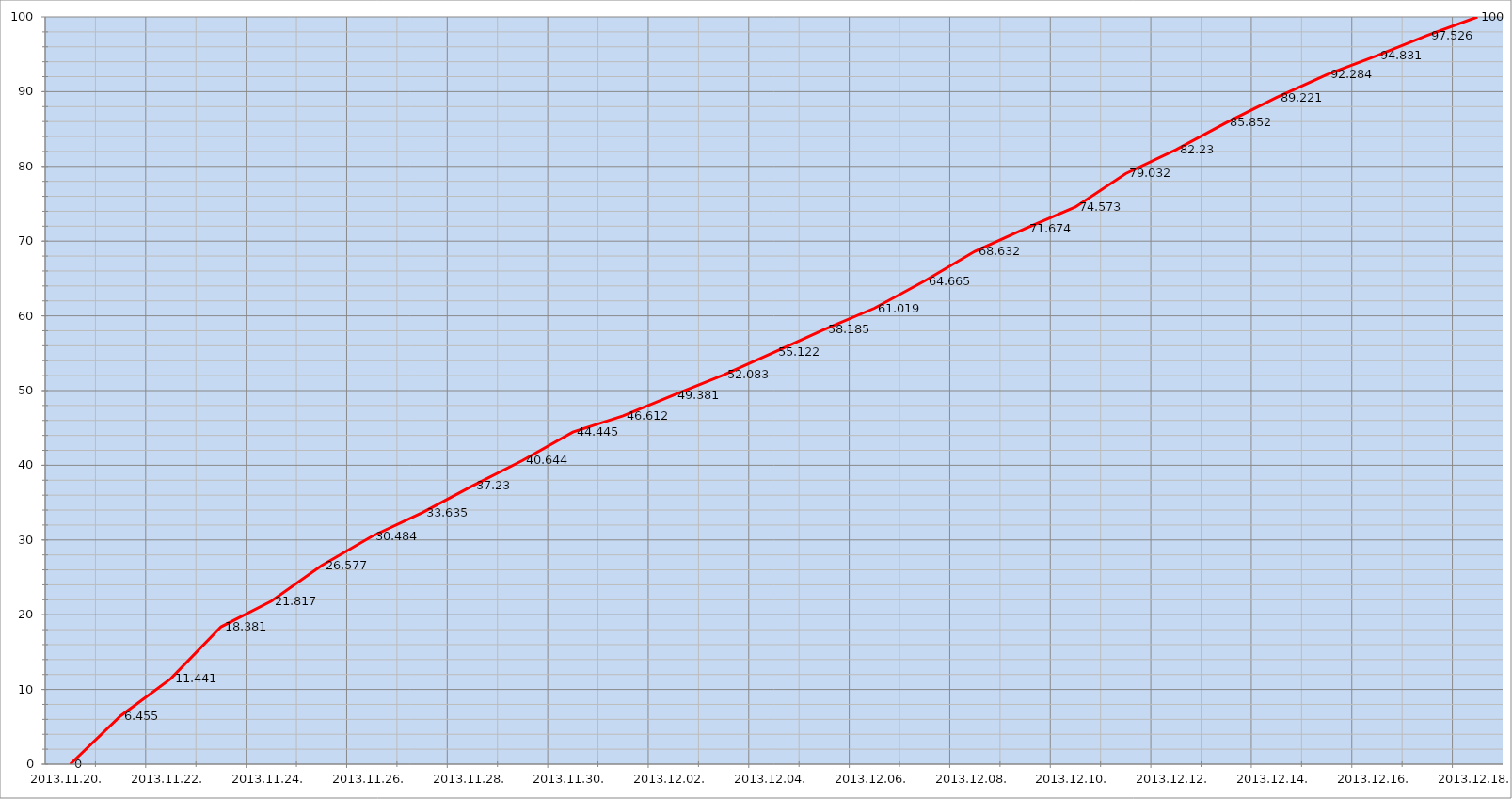
| Category | Szerver 2 |
|---|---|
| 2013-11-20 | 0 |
| 2013-11-21 | 6.455 |
| 2013-11-22 | 11.441 |
| 2013-11-23 | 18.381 |
| 2013-11-24 | 21.817 |
| 2013-11-25 | 26.577 |
| 2013-11-26 | 30.484 |
| 2013-11-27 | 33.635 |
| 2013-11-28 | 37.23 |
| 2013-11-29 | 40.644 |
| 2013-11-30 | 44.445 |
| 2013-12-01 | 46.612 |
| 2013-12-02 | 49.381 |
| 2013-12-03 | 52.083 |
| 2013-12-04 | 55.122 |
| 2013-12-05 | 58.185 |
| 2013-12-06 | 61.019 |
| 2013-12-07 | 64.665 |
| 2013-12-08 | 68.632 |
| 2013-12-09 | 71.674 |
| 2013-12-10 | 74.573 |
| 2013-12-11 | 79.032 |
| 2013-12-12 | 82.23 |
| 2013-12-13 | 85.852 |
| 2013-12-14 | 89.221 |
| 2013-12-15 | 92.284 |
| 2013-12-16 | 94.831 |
| 2013-12-17 | 97.526 |
| 2013-12-18 | 100 |